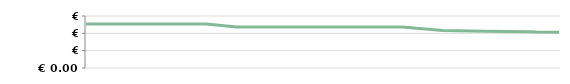
| Category | TRIMESTRE   |
|---|---|
| 2013-04-23 | 50800 |
| 2013-04-25 | 50800 |
| 2013-05-07 | 50800 |
| 2013-05-14 | 50800 |
| 2013-05-14 | 50800 |
| 2013-05-29 | 50800 |
| 2013-06-10 | 50800 |
| 2013-06-21 | 50800 |
| 2013-07-06 | 47400 |
| 2013-08-05 | 47400 |
| 2013-08-19 | 47400 |
| 2013-09-04 | 47400 |
| 2013-09-20 | 47400 |
| 2013-09-25 | 47400 |
| 2013-10-15 | 43258.14 |
| 2013-11-05 | 42312.903 |
| 2013-11-26 | 41811.111 |
| 2013-11-30 | 41500 |
| 2013-12-11 | 41288.235 |